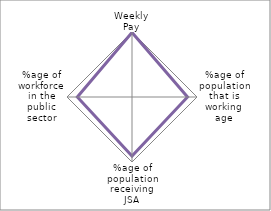
| Category | Series 3 |
|---|---|
| Weekly Pay | 150 |
| %age of population that is working age | 129 |
| %age of population receiving JSA | 137 |
| %age of workforce in the public sector | 127 |